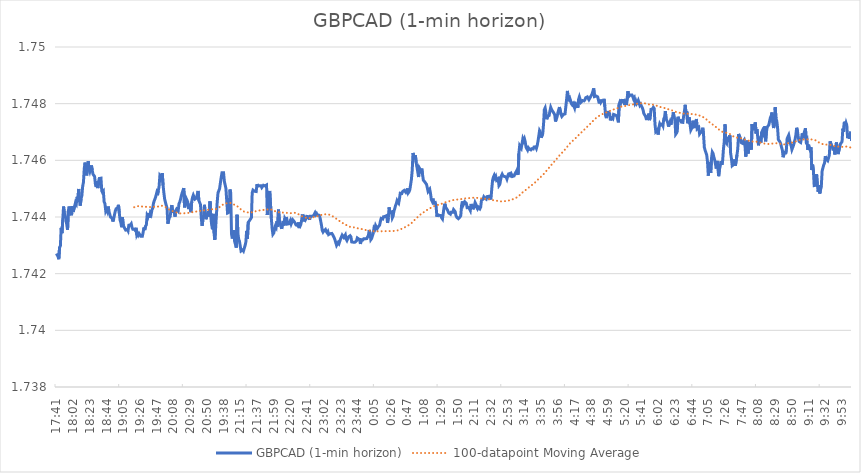
| Category | GBPCAD (1-min horizon) |
|---|---|
| 2019-04-05 17:41:00 | 1.743 |
| 2019-04-05 17:42:00 | 1.743 |
| 2019-04-05 17:43:00 | 1.743 |
| 2019-04-05 17:44:00 | 1.743 |
| 2019-04-05 17:45:00 | 1.743 |
| 2019-04-05 17:46:00 | 1.743 |
| 2019-04-05 17:47:00 | 1.744 |
| 2019-04-05 17:48:00 | 1.743 |
| 2019-04-05 17:49:00 | 1.744 |
| 2019-04-05 17:50:00 | 1.744 |
| 2019-04-05 17:51:00 | 1.744 |
| 2019-04-05 17:52:00 | 1.744 |
| 2019-04-05 17:53:00 | 1.744 |
| 2019-04-05 17:54:00 | 1.744 |
| 2019-04-05 17:55:00 | 1.744 |
| 2019-04-05 17:56:00 | 1.744 |
| 2019-04-05 17:57:00 | 1.744 |
| 2019-04-05 17:58:00 | 1.744 |
| 2019-04-05 17:59:00 | 1.744 |
| 2019-04-05 18:00:00 | 1.744 |
| 2019-04-05 18:01:00 | 1.744 |
| 2019-04-05 18:02:00 | 1.744 |
| 2019-04-05 18:03:00 | 1.744 |
| 2019-04-05 18:04:00 | 1.744 |
| 2019-04-05 18:05:00 | 1.745 |
| 2019-04-05 18:06:00 | 1.744 |
| 2019-04-05 18:07:00 | 1.745 |
| 2019-04-05 18:08:00 | 1.745 |
| 2019-04-05 18:09:00 | 1.745 |
| 2019-04-05 18:10:00 | 1.745 |
| 2019-04-05 18:11:00 | 1.744 |
| 2019-04-05 18:12:00 | 1.745 |
| 2019-04-05 18:13:00 | 1.745 |
| 2019-04-05 18:14:00 | 1.745 |
| 2019-04-05 18:15:00 | 1.745 |
| 2019-04-05 18:16:00 | 1.746 |
| 2019-04-05 18:17:00 | 1.746 |
| 2019-04-05 18:18:00 | 1.746 |
| 2019-04-05 18:19:00 | 1.745 |
| 2019-04-05 18:20:00 | 1.746 |
| 2019-04-05 18:21:00 | 1.746 |
| 2019-04-05 18:22:00 | 1.746 |
| 2019-04-05 18:23:00 | 1.746 |
| 2019-04-05 18:24:00 | 1.746 |
| 2019-04-05 18:25:00 | 1.746 |
| 2019-04-05 18:26:00 | 1.746 |
| 2019-04-05 18:27:00 | 1.746 |
| 2019-04-05 18:28:00 | 1.746 |
| 2019-04-05 18:29:00 | 1.745 |
| 2019-04-05 18:30:00 | 1.745 |
| 2019-04-05 18:31:00 | 1.745 |
| 2019-04-05 18:32:00 | 1.745 |
| 2019-04-05 18:33:00 | 1.745 |
| 2019-04-05 18:34:00 | 1.745 |
| 2019-04-05 18:35:00 | 1.745 |
| 2019-04-05 18:36:00 | 1.745 |
| 2019-04-05 18:37:00 | 1.745 |
| 2019-04-05 18:38:00 | 1.745 |
| 2019-04-05 18:39:00 | 1.745 |
| 2019-04-05 18:40:00 | 1.745 |
| 2019-04-05 18:41:00 | 1.745 |
| 2019-04-05 18:42:00 | 1.744 |
| 2019-04-05 18:43:00 | 1.744 |
| 2019-04-05 18:44:00 | 1.744 |
| 2019-04-05 18:45:00 | 1.744 |
| 2019-04-05 18:46:00 | 1.744 |
| 2019-04-05 18:47:00 | 1.744 |
| 2019-04-05 18:48:00 | 1.744 |
| 2019-04-05 18:49:00 | 1.744 |
| 2019-04-05 18:50:00 | 1.744 |
| 2019-04-05 18:51:00 | 1.744 |
| 2019-04-05 18:52:00 | 1.744 |
| 2019-04-05 18:53:00 | 1.744 |
| 2019-04-05 18:54:00 | 1.744 |
| 2019-04-05 18:55:00 | 1.744 |
| 2019-04-05 18:56:00 | 1.744 |
| 2019-04-05 18:57:00 | 1.744 |
| 2019-04-05 18:58:00 | 1.744 |
| 2019-04-05 18:59:00 | 1.744 |
| 2019-04-05 19:00:00 | 1.744 |
| 2019-04-05 19:01:00 | 1.744 |
| 2019-04-05 19:02:00 | 1.744 |
| 2019-04-05 19:03:00 | 1.744 |
| 2019-04-05 19:04:00 | 1.744 |
| 2019-04-05 19:05:00 | 1.744 |
| 2019-04-05 19:06:00 | 1.744 |
| 2019-04-05 19:07:00 | 1.744 |
| 2019-04-05 19:08:00 | 1.744 |
| 2019-04-05 19:09:00 | 1.744 |
| 2019-04-05 19:10:00 | 1.744 |
| 2019-04-05 19:11:00 | 1.744 |
| 2019-04-05 19:12:00 | 1.744 |
| 2019-04-05 19:13:00 | 1.744 |
| 2019-04-05 19:14:00 | 1.744 |
| 2019-04-05 19:15:00 | 1.744 |
| 2019-04-05 19:16:00 | 1.744 |
| 2019-04-05 19:17:00 | 1.744 |
| 2019-04-05 19:18:00 | 1.744 |
| 2019-04-05 19:19:00 | 1.744 |
| 2019-04-05 19:20:00 | 1.744 |
| 2019-04-05 19:21:00 | 1.744 |
| 2019-04-05 19:22:00 | 1.743 |
| 2019-04-05 19:23:00 | 1.743 |
| 2019-04-05 19:24:00 | 1.743 |
| 2019-04-05 19:25:00 | 1.743 |
| 2019-04-05 19:26:00 | 1.743 |
| 2019-04-05 19:27:00 | 1.743 |
| 2019-04-05 19:28:00 | 1.743 |
| 2019-04-05 19:29:00 | 1.743 |
| 2019-04-05 19:30:00 | 1.743 |
| 2019-04-05 19:31:00 | 1.744 |
| 2019-04-05 19:32:00 | 1.744 |
| 2019-04-05 19:33:00 | 1.744 |
| 2019-04-05 19:34:00 | 1.744 |
| 2019-04-05 19:35:00 | 1.744 |
| 2019-04-05 19:36:00 | 1.744 |
| 2019-04-05 19:37:00 | 1.744 |
| 2019-04-05 19:38:00 | 1.744 |
| 2019-04-05 19:39:00 | 1.744 |
| 2019-04-05 19:40:00 | 1.744 |
| 2019-04-05 19:41:00 | 1.744 |
| 2019-04-05 19:42:00 | 1.744 |
| 2019-04-05 19:43:00 | 1.744 |
| 2019-04-05 19:44:00 | 1.745 |
| 2019-04-05 19:45:00 | 1.745 |
| 2019-04-05 19:46:00 | 1.745 |
| 2019-04-05 19:47:00 | 1.745 |
| 2019-04-05 19:48:00 | 1.745 |
| 2019-04-05 19:49:00 | 1.745 |
| 2019-04-05 19:50:00 | 1.745 |
| 2019-04-05 19:51:00 | 1.745 |
| 2019-04-05 19:52:00 | 1.745 |
| 2019-04-05 19:53:00 | 1.745 |
| 2019-04-05 19:54:00 | 1.746 |
| 2019-04-05 19:55:00 | 1.745 |
| 2019-04-05 19:56:00 | 1.745 |
| 2019-04-05 19:57:00 | 1.745 |
| 2019-04-05 19:58:00 | 1.745 |
| 2019-04-05 19:59:00 | 1.744 |
| 2019-04-05 20:00:00 | 1.744 |
| 2019-04-05 20:01:00 | 1.744 |
| 2019-04-05 20:02:00 | 1.744 |
| 2019-04-05 20:03:00 | 1.744 |
| 2019-04-05 20:04:00 | 1.744 |
| 2019-04-05 20:05:00 | 1.744 |
| 2019-04-05 20:06:00 | 1.744 |
| 2019-04-05 20:07:00 | 1.744 |
| 2019-04-05 20:08:00 | 1.744 |
| 2019-04-05 20:09:00 | 1.744 |
| 2019-04-05 20:10:00 | 1.744 |
| 2019-04-05 20:11:00 | 1.744 |
| 2019-04-05 20:12:00 | 1.744 |
| 2019-04-05 20:13:00 | 1.744 |
| 2019-04-05 20:14:00 | 1.744 |
| 2019-04-05 20:15:00 | 1.744 |
| 2019-04-05 20:16:00 | 1.745 |
| 2019-04-05 20:17:00 | 1.745 |
| 2019-04-05 20:18:00 | 1.745 |
| 2019-04-05 20:19:00 | 1.745 |
| 2019-04-05 20:20:00 | 1.745 |
| 2019-04-05 20:21:00 | 1.745 |
| 2019-04-05 20:22:00 | 1.744 |
| 2019-04-05 20:23:00 | 1.744 |
| 2019-04-05 20:24:00 | 1.745 |
| 2019-04-05 20:25:00 | 1.745 |
| 2019-04-05 20:26:00 | 1.745 |
| 2019-04-05 20:27:00 | 1.744 |
| 2019-04-05 20:28:00 | 1.744 |
| 2019-04-05 20:29:00 | 1.744 |
| 2019-04-05 20:30:00 | 1.744 |
| 2019-04-05 20:31:00 | 1.745 |
| 2019-04-05 20:32:00 | 1.745 |
| 2019-04-05 20:33:00 | 1.745 |
| 2019-04-05 20:34:00 | 1.745 |
| 2019-04-05 20:35:00 | 1.745 |
| 2019-04-05 20:36:00 | 1.745 |
| 2019-04-05 20:37:00 | 1.745 |
| 2019-04-05 20:38:00 | 1.745 |
| 2019-04-05 20:39:00 | 1.745 |
| 2019-04-05 20:40:00 | 1.745 |
| 2019-04-05 20:41:00 | 1.745 |
| 2019-04-05 20:42:00 | 1.744 |
| 2019-04-05 20:43:00 | 1.744 |
| 2019-04-05 20:44:00 | 1.744 |
| 2019-04-05 20:45:00 | 1.744 |
| 2019-04-05 20:46:00 | 1.744 |
| 2019-04-05 20:47:00 | 1.744 |
| 2019-04-05 20:48:00 | 1.744 |
| 2019-04-05 20:49:00 | 1.744 |
| 2019-04-05 20:50:00 | 1.744 |
| 2019-04-05 20:51:00 | 1.744 |
| 2019-04-05 20:52:00 | 1.744 |
| 2019-04-05 20:53:00 | 1.744 |
| 2019-04-05 20:54:00 | 1.745 |
| 2019-04-05 20:55:00 | 1.744 |
| 2019-04-05 20:56:00 | 1.744 |
| 2019-04-05 20:57:00 | 1.744 |
| 2019-04-05 20:58:00 | 1.744 |
| 2019-04-07 19:00:00 | 1.743 |
| 2019-04-07 19:01:00 | 1.743 |
| 2019-04-07 19:02:00 | 1.744 |
| 2019-04-07 19:05:00 | 1.744 |
| 2019-04-07 19:08:00 | 1.745 |
| 2019-04-07 19:09:00 | 1.745 |
| 2019-04-07 19:10:00 | 1.745 |
| 2019-04-07 19:12:00 | 1.745 |
| 2019-04-07 19:13:00 | 1.745 |
| 2019-04-07 19:16:00 | 1.745 |
| 2019-04-07 19:17:00 | 1.746 |
| 2019-04-07 19:25:00 | 1.746 |
| 2019-04-07 19:38:00 | 1.746 |
| 2019-04-07 19:41:00 | 1.745 |
| 2019-04-07 19:42:00 | 1.745 |
| 2019-04-07 19:45:00 | 1.745 |
| 2019-04-07 19:58:00 | 1.745 |
| 2019-04-07 20:59:00 | 1.744 |
| 2019-04-07 21:00:00 | 1.744 |
| 2019-04-07 21:01:00 | 1.744 |
| 2019-04-07 21:02:00 | 1.745 |
| 2019-04-07 21:03:00 | 1.745 |
| 2019-04-07 21:04:00 | 1.743 |
| 2019-04-07 21:05:00 | 1.743 |
| 2019-04-07 21:06:00 | 1.743 |
| 2019-04-07 21:07:00 | 1.744 |
| 2019-04-07 21:08:00 | 1.743 |
| 2019-04-07 21:09:00 | 1.743 |
| 2019-04-07 21:10:00 | 1.743 |
| 2019-04-07 21:11:00 | 1.744 |
| 2019-04-07 21:12:00 | 1.743 |
| 2019-04-07 21:13:00 | 1.743 |
| 2019-04-07 21:14:00 | 1.743 |
| 2019-04-07 21:15:00 | 1.743 |
| 2019-04-07 21:16:00 | 1.743 |
| 2019-04-07 21:17:00 | 1.743 |
| 2019-04-07 21:18:00 | 1.743 |
| 2019-04-07 21:19:00 | 1.743 |
| 2019-04-07 21:20:00 | 1.743 |
| 2019-04-07 21:21:00 | 1.743 |
| 2019-04-07 21:22:00 | 1.743 |
| 2019-04-07 21:23:00 | 1.744 |
| 2019-04-07 21:24:00 | 1.743 |
| 2019-04-07 21:25:00 | 1.744 |
| 2019-04-07 21:26:00 | 1.744 |
| 2019-04-07 21:27:00 | 1.744 |
| 2019-04-07 21:28:00 | 1.744 |
| 2019-04-07 21:29:00 | 1.744 |
| 2019-04-07 21:30:00 | 1.745 |
| 2019-04-07 21:31:00 | 1.745 |
| 2019-04-07 21:32:00 | 1.745 |
| 2019-04-07 21:33:00 | 1.745 |
| 2019-04-07 21:35:00 | 1.745 |
| 2019-04-07 21:36:00 | 1.745 |
| 2019-04-07 21:37:00 | 1.745 |
| 2019-04-07 21:38:00 | 1.745 |
| 2019-04-07 21:39:00 | 1.745 |
| 2019-04-07 21:40:00 | 1.745 |
| 2019-04-07 21:41:00 | 1.745 |
| 2019-04-07 21:43:00 | 1.745 |
| 2019-04-07 21:44:00 | 1.745 |
| 2019-04-07 21:45:00 | 1.745 |
| 2019-04-07 21:46:00 | 1.745 |
| 2019-04-07 21:47:00 | 1.745 |
| 2019-04-07 21:48:00 | 1.745 |
| 2019-04-07 21:49:00 | 1.745 |
| 2019-04-07 21:50:00 | 1.745 |
| 2019-04-07 21:51:00 | 1.744 |
| 2019-04-07 21:52:00 | 1.745 |
| 2019-04-07 21:53:00 | 1.745 |
| 2019-04-07 21:54:00 | 1.745 |
| 2019-04-07 21:55:00 | 1.745 |
| 2019-04-07 21:56:00 | 1.744 |
| 2019-04-07 21:57:00 | 1.744 |
| 2019-04-07 21:58:00 | 1.743 |
| 2019-04-07 21:59:00 | 1.743 |
| 2019-04-07 22:00:00 | 1.743 |
| 2019-04-07 22:01:00 | 1.744 |
| 2019-04-07 22:02:00 | 1.744 |
| 2019-04-07 22:03:00 | 1.744 |
| 2019-04-07 22:04:00 | 1.744 |
| 2019-04-07 22:05:00 | 1.744 |
| 2019-04-07 22:06:00 | 1.744 |
| 2019-04-07 22:07:00 | 1.744 |
| 2019-04-07 22:08:00 | 1.744 |
| 2019-04-07 22:09:00 | 1.744 |
| 2019-04-07 22:10:00 | 1.744 |
| 2019-04-07 22:11:00 | 1.744 |
| 2019-04-07 22:12:00 | 1.744 |
| 2019-04-07 22:13:00 | 1.744 |
| 2019-04-07 22:14:00 | 1.744 |
| 2019-04-07 22:15:00 | 1.744 |
| 2019-04-07 22:16:00 | 1.744 |
| 2019-04-07 22:17:00 | 1.744 |
| 2019-04-07 22:18:00 | 1.744 |
| 2019-04-07 22:19:00 | 1.744 |
| 2019-04-07 22:20:00 | 1.744 |
| 2019-04-07 22:21:00 | 1.744 |
| 2019-04-07 22:22:00 | 1.744 |
| 2019-04-07 22:23:00 | 1.744 |
| 2019-04-07 22:24:00 | 1.744 |
| 2019-04-07 22:25:00 | 1.744 |
| 2019-04-07 22:26:00 | 1.744 |
| 2019-04-07 22:27:00 | 1.744 |
| 2019-04-07 22:28:00 | 1.744 |
| 2019-04-07 22:29:00 | 1.744 |
| 2019-04-07 22:30:00 | 1.744 |
| 2019-04-07 22:31:00 | 1.744 |
| 2019-04-07 22:32:00 | 1.744 |
| 2019-04-07 22:33:00 | 1.744 |
| 2019-04-07 22:34:00 | 1.744 |
| 2019-04-07 22:35:00 | 1.744 |
| 2019-04-07 22:36:00 | 1.744 |
| 2019-04-07 22:37:00 | 1.744 |
| 2019-04-07 22:38:00 | 1.744 |
| 2019-04-07 22:39:00 | 1.744 |
| 2019-04-07 22:40:00 | 1.744 |
| 2019-04-07 22:41:00 | 1.744 |
| 2019-04-07 22:42:00 | 1.744 |
| 2019-04-07 22:43:00 | 1.744 |
| 2019-04-07 22:44:00 | 1.744 |
| 2019-04-07 22:45:00 | 1.744 |
| 2019-04-07 22:46:00 | 1.744 |
| 2019-04-07 22:47:00 | 1.744 |
| 2019-04-07 22:48:00 | 1.744 |
| 2019-04-07 22:49:00 | 1.744 |
| 2019-04-07 22:50:00 | 1.744 |
| 2019-04-07 22:51:00 | 1.744 |
| 2019-04-07 22:52:00 | 1.744 |
| 2019-04-07 22:53:00 | 1.744 |
| 2019-04-07 22:54:00 | 1.744 |
| 2019-04-07 22:55:00 | 1.744 |
| 2019-04-07 22:56:00 | 1.744 |
| 2019-04-07 22:57:00 | 1.744 |
| 2019-04-07 22:58:00 | 1.744 |
| 2019-04-07 22:59:00 | 1.744 |
| 2019-04-07 23:00:00 | 1.744 |
| 2019-04-07 23:01:00 | 1.743 |
| 2019-04-07 23:02:00 | 1.744 |
| 2019-04-07 23:03:00 | 1.744 |
| 2019-04-07 23:04:00 | 1.744 |
| 2019-04-07 23:05:00 | 1.743 |
| 2019-04-07 23:06:00 | 1.743 |
| 2019-04-07 23:07:00 | 1.743 |
| 2019-04-07 23:08:00 | 1.743 |
| 2019-04-07 23:09:00 | 1.743 |
| 2019-04-07 23:10:00 | 1.743 |
| 2019-04-07 23:11:00 | 1.743 |
| 2019-04-07 23:12:00 | 1.743 |
| 2019-04-07 23:13:00 | 1.743 |
| 2019-04-07 23:14:00 | 1.743 |
| 2019-04-07 23:15:00 | 1.743 |
| 2019-04-07 23:16:00 | 1.743 |
| 2019-04-07 23:17:00 | 1.743 |
| 2019-04-07 23:18:00 | 1.743 |
| 2019-04-07 23:19:00 | 1.743 |
| 2019-04-07 23:20:00 | 1.743 |
| 2019-04-07 23:21:00 | 1.743 |
| 2019-04-07 23:22:00 | 1.743 |
| 2019-04-07 23:23:00 | 1.743 |
| 2019-04-07 23:24:00 | 1.743 |
| 2019-04-07 23:25:00 | 1.743 |
| 2019-04-07 23:26:00 | 1.743 |
| 2019-04-07 23:27:00 | 1.743 |
| 2019-04-07 23:28:00 | 1.743 |
| 2019-04-07 23:29:00 | 1.743 |
| 2019-04-07 23:30:00 | 1.743 |
| 2019-04-07 23:31:00 | 1.743 |
| 2019-04-07 23:32:00 | 1.743 |
| 2019-04-07 23:33:00 | 1.743 |
| 2019-04-07 23:34:00 | 1.743 |
| 2019-04-07 23:35:00 | 1.743 |
| 2019-04-07 23:36:00 | 1.743 |
| 2019-04-07 23:37:00 | 1.743 |
| 2019-04-07 23:38:00 | 1.743 |
| 2019-04-07 23:39:00 | 1.743 |
| 2019-04-07 23:40:00 | 1.743 |
| 2019-04-07 23:41:00 | 1.743 |
| 2019-04-07 23:42:00 | 1.743 |
| 2019-04-07 23:43:00 | 1.743 |
| 2019-04-07 23:44:00 | 1.743 |
| 2019-04-07 23:45:00 | 1.743 |
| 2019-04-07 23:46:00 | 1.743 |
| 2019-04-07 23:47:00 | 1.743 |
| 2019-04-07 23:48:00 | 1.743 |
| 2019-04-07 23:49:00 | 1.743 |
| 2019-04-07 23:50:00 | 1.743 |
| 2019-04-07 23:51:00 | 1.743 |
| 2019-04-07 23:52:00 | 1.743 |
| 2019-04-07 23:53:00 | 1.743 |
| 2019-04-07 23:54:00 | 1.743 |
| 2019-04-07 23:55:00 | 1.743 |
| 2019-04-07 23:56:00 | 1.743 |
| 2019-04-07 23:57:00 | 1.743 |
| 2019-04-07 23:58:00 | 1.743 |
| 2019-04-07 23:59:00 | 1.744 |
| 2019-04-08 | 1.743 |
| 2019-04-08 00:01:00 | 1.743 |
| 2019-04-08 00:02:00 | 1.743 |
| 2019-04-08 00:03:00 | 1.743 |
| 2019-04-08 00:04:00 | 1.743 |
| 2019-04-08 00:05:00 | 1.744 |
| 2019-04-08 00:06:00 | 1.744 |
| 2019-04-08 00:07:00 | 1.744 |
| 2019-04-08 00:08:00 | 1.744 |
| 2019-04-08 00:09:00 | 1.744 |
| 2019-04-08 00:10:00 | 1.744 |
| 2019-04-08 00:11:00 | 1.744 |
| 2019-04-08 00:12:00 | 1.744 |
| 2019-04-08 00:13:00 | 1.744 |
| 2019-04-08 00:14:00 | 1.744 |
| 2019-04-08 00:15:00 | 1.744 |
| 2019-04-08 00:16:00 | 1.744 |
| 2019-04-08 00:17:00 | 1.744 |
| 2019-04-08 00:18:00 | 1.744 |
| 2019-04-08 00:19:00 | 1.744 |
| 2019-04-08 00:20:00 | 1.744 |
| 2019-04-08 00:21:00 | 1.744 |
| 2019-04-08 00:22:00 | 1.744 |
| 2019-04-08 00:23:00 | 1.744 |
| 2019-04-08 00:24:00 | 1.744 |
| 2019-04-08 00:25:00 | 1.744 |
| 2019-04-08 00:26:00 | 1.744 |
| 2019-04-08 00:27:00 | 1.744 |
| 2019-04-08 00:28:00 | 1.744 |
| 2019-04-08 00:29:00 | 1.744 |
| 2019-04-08 00:30:00 | 1.744 |
| 2019-04-08 00:31:00 | 1.744 |
| 2019-04-08 00:32:00 | 1.744 |
| 2019-04-08 00:33:00 | 1.744 |
| 2019-04-08 00:34:00 | 1.745 |
| 2019-04-08 00:35:00 | 1.745 |
| 2019-04-08 00:36:00 | 1.744 |
| 2019-04-08 00:37:00 | 1.745 |
| 2019-04-08 00:38:00 | 1.745 |
| 2019-04-08 00:39:00 | 1.745 |
| 2019-04-08 00:40:00 | 1.745 |
| 2019-04-08 00:41:00 | 1.745 |
| 2019-04-08 00:42:00 | 1.745 |
| 2019-04-08 00:43:00 | 1.745 |
| 2019-04-08 00:44:00 | 1.745 |
| 2019-04-08 00:45:00 | 1.745 |
| 2019-04-08 00:46:00 | 1.745 |
| 2019-04-08 00:47:00 | 1.745 |
| 2019-04-08 00:48:00 | 1.745 |
| 2019-04-08 00:49:00 | 1.745 |
| 2019-04-08 00:50:00 | 1.745 |
| 2019-04-08 00:51:00 | 1.745 |
| 2019-04-08 00:52:00 | 1.745 |
| 2019-04-08 00:53:00 | 1.746 |
| 2019-04-08 00:54:00 | 1.746 |
| 2019-04-08 00:55:00 | 1.746 |
| 2019-04-08 00:56:00 | 1.746 |
| 2019-04-08 00:57:00 | 1.746 |
| 2019-04-08 00:58:00 | 1.746 |
| 2019-04-08 00:59:00 | 1.746 |
| 2019-04-08 01:00:00 | 1.746 |
| 2019-04-08 01:01:00 | 1.745 |
| 2019-04-08 01:02:00 | 1.746 |
| 2019-04-08 01:03:00 | 1.746 |
| 2019-04-08 01:04:00 | 1.746 |
| 2019-04-08 01:05:00 | 1.746 |
| 2019-04-08 01:06:00 | 1.745 |
| 2019-04-08 01:07:00 | 1.745 |
| 2019-04-08 01:08:00 | 1.745 |
| 2019-04-08 01:09:00 | 1.745 |
| 2019-04-08 01:10:00 | 1.745 |
| 2019-04-08 01:11:00 | 1.745 |
| 2019-04-08 01:12:00 | 1.745 |
| 2019-04-08 01:13:00 | 1.745 |
| 2019-04-08 01:14:00 | 1.745 |
| 2019-04-08 01:15:00 | 1.745 |
| 2019-04-08 01:16:00 | 1.745 |
| 2019-04-08 01:17:00 | 1.745 |
| 2019-04-08 01:18:00 | 1.745 |
| 2019-04-08 01:19:00 | 1.745 |
| 2019-04-08 01:20:00 | 1.744 |
| 2019-04-08 01:21:00 | 1.744 |
| 2019-04-08 01:22:00 | 1.745 |
| 2019-04-08 01:23:00 | 1.744 |
| 2019-04-08 01:24:00 | 1.744 |
| 2019-04-08 01:25:00 | 1.744 |
| 2019-04-08 01:26:00 | 1.744 |
| 2019-04-08 01:27:00 | 1.744 |
| 2019-04-08 01:28:00 | 1.744 |
| 2019-04-08 01:29:00 | 1.744 |
| 2019-04-08 01:30:00 | 1.744 |
| 2019-04-08 01:31:00 | 1.744 |
| 2019-04-08 01:32:00 | 1.744 |
| 2019-04-08 01:33:00 | 1.744 |
| 2019-04-08 01:34:00 | 1.744 |
| 2019-04-08 01:35:00 | 1.744 |
| 2019-04-08 01:36:00 | 1.744 |
| 2019-04-08 01:37:00 | 1.744 |
| 2019-04-08 01:38:00 | 1.744 |
| 2019-04-08 01:39:00 | 1.744 |
| 2019-04-08 01:40:00 | 1.744 |
| 2019-04-08 01:41:00 | 1.744 |
| 2019-04-08 01:42:00 | 1.744 |
| 2019-04-08 01:43:00 | 1.744 |
| 2019-04-08 01:44:00 | 1.744 |
| 2019-04-08 01:45:00 | 1.744 |
| 2019-04-08 01:46:00 | 1.744 |
| 2019-04-08 01:47:00 | 1.744 |
| 2019-04-08 01:48:00 | 1.744 |
| 2019-04-08 01:49:00 | 1.744 |
| 2019-04-08 01:50:00 | 1.744 |
| 2019-04-08 01:51:00 | 1.744 |
| 2019-04-08 01:52:00 | 1.744 |
| 2019-04-08 01:53:00 | 1.744 |
| 2019-04-08 01:54:00 | 1.744 |
| 2019-04-08 01:55:00 | 1.744 |
| 2019-04-08 01:56:00 | 1.745 |
| 2019-04-08 01:57:00 | 1.744 |
| 2019-04-08 01:58:00 | 1.744 |
| 2019-04-08 01:59:00 | 1.745 |
| 2019-04-08 02:00:00 | 1.745 |
| 2019-04-08 02:01:00 | 1.744 |
| 2019-04-08 02:02:00 | 1.744 |
| 2019-04-08 02:03:00 | 1.744 |
| 2019-04-08 02:04:00 | 1.744 |
| 2019-04-08 02:05:00 | 1.744 |
| 2019-04-08 02:06:00 | 1.744 |
| 2019-04-08 02:07:00 | 1.744 |
| 2019-04-08 02:08:00 | 1.744 |
| 2019-04-08 02:09:00 | 1.744 |
| 2019-04-08 02:10:00 | 1.744 |
| 2019-04-08 02:11:00 | 1.744 |
| 2019-04-08 02:12:00 | 1.745 |
| 2019-04-08 02:13:00 | 1.744 |
| 2019-04-08 02:14:00 | 1.744 |
| 2019-04-08 02:15:00 | 1.744 |
| 2019-04-08 02:16:00 | 1.744 |
| 2019-04-08 02:17:00 | 1.744 |
| 2019-04-08 02:18:00 | 1.744 |
| 2019-04-08 02:19:00 | 1.744 |
| 2019-04-08 02:20:00 | 1.745 |
| 2019-04-08 02:21:00 | 1.745 |
| 2019-04-08 02:22:00 | 1.745 |
| 2019-04-08 02:23:00 | 1.745 |
| 2019-04-08 02:24:00 | 1.745 |
| 2019-04-08 02:25:00 | 1.745 |
| 2019-04-08 02:26:00 | 1.745 |
| 2019-04-08 02:27:00 | 1.745 |
| 2019-04-08 02:28:00 | 1.745 |
| 2019-04-08 02:29:00 | 1.745 |
| 2019-04-08 02:30:00 | 1.745 |
| 2019-04-08 02:31:00 | 1.745 |
| 2019-04-08 02:32:00 | 1.745 |
| 2019-04-08 02:33:00 | 1.745 |
| 2019-04-08 02:34:00 | 1.745 |
| 2019-04-08 02:35:00 | 1.745 |
| 2019-04-08 02:36:00 | 1.745 |
| 2019-04-08 02:37:00 | 1.745 |
| 2019-04-08 02:38:00 | 1.745 |
| 2019-04-08 02:39:00 | 1.745 |
| 2019-04-08 02:40:00 | 1.745 |
| 2019-04-08 02:41:00 | 1.745 |
| 2019-04-08 02:42:00 | 1.745 |
| 2019-04-08 02:43:00 | 1.745 |
| 2019-04-08 02:44:00 | 1.745 |
| 2019-04-08 02:45:00 | 1.745 |
| 2019-04-08 02:46:00 | 1.746 |
| 2019-04-08 02:47:00 | 1.745 |
| 2019-04-08 02:48:00 | 1.745 |
| 2019-04-08 02:49:00 | 1.745 |
| 2019-04-08 02:50:00 | 1.745 |
| 2019-04-08 02:51:00 | 1.745 |
| 2019-04-08 02:52:00 | 1.745 |
| 2019-04-08 02:53:00 | 1.745 |
| 2019-04-08 02:54:00 | 1.746 |
| 2019-04-08 02:55:00 | 1.746 |
| 2019-04-08 02:56:00 | 1.746 |
| 2019-04-08 02:57:00 | 1.745 |
| 2019-04-08 02:58:00 | 1.745 |
| 2019-04-08 02:59:00 | 1.745 |
| 2019-04-08 03:00:00 | 1.745 |
| 2019-04-08 03:01:00 | 1.745 |
| 2019-04-08 03:02:00 | 1.746 |
| 2019-04-08 03:03:00 | 1.746 |
| 2019-04-08 03:04:00 | 1.746 |
| 2019-04-08 03:05:00 | 1.746 |
| 2019-04-08 03:06:00 | 1.745 |
| 2019-04-08 03:07:00 | 1.746 |
| 2019-04-08 03:08:00 | 1.747 |
| 2019-04-08 03:09:00 | 1.747 |
| 2019-04-08 03:10:00 | 1.746 |
| 2019-04-08 03:11:00 | 1.747 |
| 2019-04-08 03:12:00 | 1.747 |
| 2019-04-08 03:13:00 | 1.747 |
| 2019-04-08 03:14:00 | 1.747 |
| 2019-04-08 03:15:00 | 1.747 |
| 2019-04-08 03:16:00 | 1.746 |
| 2019-04-08 03:17:00 | 1.746 |
| 2019-04-08 03:18:00 | 1.746 |
| 2019-04-08 03:19:00 | 1.746 |
| 2019-04-08 03:20:00 | 1.746 |
| 2019-04-08 03:21:00 | 1.746 |
| 2019-04-08 03:22:00 | 1.746 |
| 2019-04-08 03:23:00 | 1.746 |
| 2019-04-08 03:24:00 | 1.746 |
| 2019-04-08 03:25:00 | 1.746 |
| 2019-04-08 03:26:00 | 1.746 |
| 2019-04-08 03:27:00 | 1.746 |
| 2019-04-08 03:28:00 | 1.746 |
| 2019-04-08 03:29:00 | 1.746 |
| 2019-04-08 03:30:00 | 1.747 |
| 2019-04-08 03:31:00 | 1.747 |
| 2019-04-08 03:32:00 | 1.747 |
| 2019-04-08 03:33:00 | 1.747 |
| 2019-04-08 03:34:00 | 1.747 |
| 2019-04-08 03:35:00 | 1.747 |
| 2019-04-08 03:36:00 | 1.747 |
| 2019-04-08 03:37:00 | 1.747 |
| 2019-04-08 03:38:00 | 1.747 |
| 2019-04-08 03:39:00 | 1.748 |
| 2019-04-08 03:40:00 | 1.748 |
| 2019-04-08 03:41:00 | 1.748 |
| 2019-04-08 03:42:00 | 1.747 |
| 2019-04-08 03:43:00 | 1.748 |
| 2019-04-08 03:44:00 | 1.748 |
| 2019-04-08 03:45:00 | 1.748 |
| 2019-04-08 03:46:00 | 1.748 |
| 2019-04-08 03:47:00 | 1.748 |
| 2019-04-08 03:48:00 | 1.748 |
| 2019-04-08 03:49:00 | 1.748 |
| 2019-04-08 03:50:00 | 1.748 |
| 2019-04-08 03:51:00 | 1.748 |
| 2019-04-08 03:52:00 | 1.748 |
| 2019-04-08 03:53:00 | 1.747 |
| 2019-04-08 03:54:00 | 1.747 |
| 2019-04-08 03:55:00 | 1.748 |
| 2019-04-08 03:56:00 | 1.748 |
| 2019-04-08 03:57:00 | 1.748 |
| 2019-04-08 03:58:00 | 1.748 |
| 2019-04-08 03:59:00 | 1.748 |
| 2019-04-08 04:00:00 | 1.748 |
| 2019-04-08 04:01:00 | 1.748 |
| 2019-04-08 04:02:00 | 1.748 |
| 2019-04-08 04:03:00 | 1.748 |
| 2019-04-08 04:04:00 | 1.748 |
| 2019-04-08 04:05:00 | 1.748 |
| 2019-04-08 04:06:00 | 1.748 |
| 2019-04-08 04:07:00 | 1.748 |
| 2019-04-08 04:08:00 | 1.748 |
| 2019-04-08 04:09:00 | 1.748 |
| 2019-04-08 04:10:00 | 1.748 |
| 2019-04-08 04:11:00 | 1.748 |
| 2019-04-08 04:12:00 | 1.748 |
| 2019-04-08 04:13:00 | 1.748 |
| 2019-04-08 04:14:00 | 1.748 |
| 2019-04-08 04:15:00 | 1.748 |
| 2019-04-08 04:16:00 | 1.748 |
| 2019-04-08 04:17:00 | 1.748 |
| 2019-04-08 04:18:00 | 1.748 |
| 2019-04-08 04:19:00 | 1.748 |
| 2019-04-08 04:20:00 | 1.748 |
| 2019-04-08 04:21:00 | 1.748 |
| 2019-04-08 04:22:00 | 1.748 |
| 2019-04-08 04:23:00 | 1.748 |
| 2019-04-08 04:24:00 | 1.748 |
| 2019-04-08 04:25:00 | 1.748 |
| 2019-04-08 04:26:00 | 1.748 |
| 2019-04-08 04:27:00 | 1.748 |
| 2019-04-08 04:28:00 | 1.748 |
| 2019-04-08 04:29:00 | 1.748 |
| 2019-04-08 04:30:00 | 1.748 |
| 2019-04-08 04:31:00 | 1.748 |
| 2019-04-08 04:32:00 | 1.748 |
| 2019-04-08 04:33:00 | 1.748 |
| 2019-04-08 04:34:00 | 1.748 |
| 2019-04-08 04:35:00 | 1.748 |
| 2019-04-08 04:36:00 | 1.748 |
| 2019-04-08 04:37:00 | 1.748 |
| 2019-04-08 04:38:00 | 1.748 |
| 2019-04-08 04:39:00 | 1.748 |
| 2019-04-08 04:40:00 | 1.748 |
| 2019-04-08 04:41:00 | 1.749 |
| 2019-04-08 04:42:00 | 1.748 |
| 2019-04-08 04:43:00 | 1.748 |
| 2019-04-08 04:44:00 | 1.748 |
| 2019-04-08 04:45:00 | 1.748 |
| 2019-04-08 04:46:00 | 1.748 |
| 2019-04-08 04:47:00 | 1.748 |
| 2019-04-08 04:48:00 | 1.748 |
| 2019-04-08 04:49:00 | 1.748 |
| 2019-04-08 04:50:00 | 1.748 |
| 2019-04-08 04:51:00 | 1.748 |
| 2019-04-08 04:52:00 | 1.748 |
| 2019-04-08 04:53:00 | 1.748 |
| 2019-04-08 04:54:00 | 1.748 |
| 2019-04-08 04:55:00 | 1.748 |
| 2019-04-08 04:56:00 | 1.748 |
| 2019-04-08 04:57:00 | 1.747 |
| 2019-04-08 04:58:00 | 1.748 |
| 2019-04-08 04:59:00 | 1.748 |
| 2019-04-08 05:00:00 | 1.748 |
| 2019-04-08 05:01:00 | 1.748 |
| 2019-04-08 05:02:00 | 1.747 |
| 2019-04-08 05:03:00 | 1.748 |
| 2019-04-08 05:04:00 | 1.748 |
| 2019-04-08 05:05:00 | 1.747 |
| 2019-04-08 05:06:00 | 1.748 |
| 2019-04-08 05:07:00 | 1.748 |
| 2019-04-08 05:08:00 | 1.748 |
| 2019-04-08 05:09:00 | 1.748 |
| 2019-04-08 05:10:00 | 1.748 |
| 2019-04-08 05:11:00 | 1.748 |
| 2019-04-08 05:12:00 | 1.747 |
| 2019-04-08 05:13:00 | 1.748 |
| 2019-04-08 05:14:00 | 1.748 |
| 2019-04-08 05:15:00 | 1.748 |
| 2019-04-08 05:16:00 | 1.748 |
| 2019-04-08 05:17:00 | 1.748 |
| 2019-04-08 05:18:00 | 1.748 |
| 2019-04-08 05:19:00 | 1.748 |
| 2019-04-08 05:20:00 | 1.748 |
| 2019-04-08 05:21:00 | 1.748 |
| 2019-04-08 05:22:00 | 1.748 |
| 2019-04-08 05:23:00 | 1.748 |
| 2019-04-08 05:24:00 | 1.748 |
| 2019-04-08 05:25:00 | 1.748 |
| 2019-04-08 05:26:00 | 1.748 |
| 2019-04-08 05:27:00 | 1.748 |
| 2019-04-08 05:28:00 | 1.748 |
| 2019-04-08 05:29:00 | 1.748 |
| 2019-04-08 05:30:00 | 1.748 |
| 2019-04-08 05:31:00 | 1.748 |
| 2019-04-08 05:32:00 | 1.748 |
| 2019-04-08 05:33:00 | 1.748 |
| 2019-04-08 05:34:00 | 1.748 |
| 2019-04-08 05:35:00 | 1.748 |
| 2019-04-08 05:36:00 | 1.748 |
| 2019-04-08 05:37:00 | 1.748 |
| 2019-04-08 05:38:00 | 1.748 |
| 2019-04-08 05:39:00 | 1.748 |
| 2019-04-08 05:40:00 | 1.748 |
| 2019-04-08 05:41:00 | 1.748 |
| 2019-04-08 05:42:00 | 1.748 |
| 2019-04-08 05:43:00 | 1.748 |
| 2019-04-08 05:44:00 | 1.748 |
| 2019-04-08 05:45:00 | 1.748 |
| 2019-04-08 05:46:00 | 1.748 |
| 2019-04-08 05:47:00 | 1.747 |
| 2019-04-08 05:48:00 | 1.748 |
| 2019-04-08 05:49:00 | 1.747 |
| 2019-04-08 05:50:00 | 1.748 |
| 2019-04-08 05:51:00 | 1.747 |
| 2019-04-08 05:52:00 | 1.748 |
| 2019-04-08 05:53:00 | 1.748 |
| 2019-04-08 05:54:00 | 1.748 |
| 2019-04-08 05:55:00 | 1.748 |
| 2019-04-08 05:56:00 | 1.748 |
| 2019-04-08 05:57:00 | 1.748 |
| 2019-04-08 05:58:00 | 1.747 |
| 2019-04-08 05:59:00 | 1.747 |
| 2019-04-08 06:00:00 | 1.747 |
| 2019-04-08 06:01:00 | 1.747 |
| 2019-04-08 06:02:00 | 1.747 |
| 2019-04-08 06:03:00 | 1.747 |
| 2019-04-08 06:04:00 | 1.747 |
| 2019-04-08 06:05:00 | 1.747 |
| 2019-04-08 06:06:00 | 1.747 |
| 2019-04-08 06:07:00 | 1.747 |
| 2019-04-08 06:08:00 | 1.747 |
| 2019-04-08 06:09:00 | 1.747 |
| 2019-04-08 06:10:00 | 1.748 |
| 2019-04-08 06:11:00 | 1.748 |
| 2019-04-08 06:12:00 | 1.747 |
| 2019-04-08 06:13:00 | 1.747 |
| 2019-04-08 06:14:00 | 1.747 |
| 2019-04-08 06:15:00 | 1.747 |
| 2019-04-08 06:16:00 | 1.747 |
| 2019-04-08 06:17:00 | 1.747 |
| 2019-04-08 06:18:00 | 1.747 |
| 2019-04-08 06:19:00 | 1.747 |
| 2019-04-08 06:20:00 | 1.748 |
| 2019-04-08 06:21:00 | 1.748 |
| 2019-04-08 06:22:00 | 1.748 |
| 2019-04-08 06:23:00 | 1.747 |
| 2019-04-08 06:24:00 | 1.747 |
| 2019-04-08 06:25:00 | 1.747 |
| 2019-04-08 06:26:00 | 1.747 |
| 2019-04-08 06:27:00 | 1.748 |
| 2019-04-08 06:28:00 | 1.747 |
| 2019-04-08 06:29:00 | 1.747 |
| 2019-04-08 06:30:00 | 1.747 |
| 2019-04-08 06:31:00 | 1.747 |
| 2019-04-08 06:32:00 | 1.747 |
| 2019-04-08 06:33:00 | 1.747 |
| 2019-04-08 06:34:00 | 1.748 |
| 2019-04-08 06:35:00 | 1.748 |
| 2019-04-08 06:36:00 | 1.748 |
| 2019-04-08 06:37:00 | 1.748 |
| 2019-04-08 06:38:00 | 1.748 |
| 2019-04-08 06:39:00 | 1.747 |
| 2019-04-08 06:40:00 | 1.747 |
| 2019-04-08 06:41:00 | 1.748 |
| 2019-04-08 06:42:00 | 1.747 |
| 2019-04-08 06:43:00 | 1.747 |
| 2019-04-08 06:44:00 | 1.747 |
| 2019-04-08 06:45:00 | 1.747 |
| 2019-04-08 06:46:00 | 1.747 |
| 2019-04-08 06:47:00 | 1.747 |
| 2019-04-08 06:48:00 | 1.747 |
| 2019-04-08 06:49:00 | 1.747 |
| 2019-04-08 06:50:00 | 1.747 |
| 2019-04-08 06:51:00 | 1.747 |
| 2019-04-08 06:52:00 | 1.747 |
| 2019-04-08 06:53:00 | 1.747 |
| 2019-04-08 06:54:00 | 1.747 |
| 2019-04-08 06:55:00 | 1.747 |
| 2019-04-08 06:56:00 | 1.747 |
| 2019-04-08 06:57:00 | 1.747 |
| 2019-04-08 06:58:00 | 1.747 |
| 2019-04-08 06:59:00 | 1.747 |
| 2019-04-08 07:00:00 | 1.746 |
| 2019-04-08 07:01:00 | 1.746 |
| 2019-04-08 07:02:00 | 1.746 |
| 2019-04-08 07:03:00 | 1.746 |
| 2019-04-08 07:04:00 | 1.746 |
| 2019-04-08 07:05:00 | 1.745 |
| 2019-04-08 07:06:00 | 1.746 |
| 2019-04-08 07:07:00 | 1.746 |
| 2019-04-08 07:08:00 | 1.746 |
| 2019-04-08 07:09:00 | 1.746 |
| 2019-04-08 07:10:00 | 1.746 |
| 2019-04-08 07:11:00 | 1.746 |
| 2019-04-08 07:12:00 | 1.746 |
| 2019-04-08 07:13:00 | 1.746 |
| 2019-04-08 07:14:00 | 1.746 |
| 2019-04-08 07:15:00 | 1.746 |
| 2019-04-08 07:16:00 | 1.746 |
| 2019-04-08 07:17:00 | 1.746 |
| 2019-04-08 07:18:00 | 1.745 |
| 2019-04-08 07:19:00 | 1.746 |
| 2019-04-08 07:20:00 | 1.746 |
| 2019-04-08 07:21:00 | 1.746 |
| 2019-04-08 07:22:00 | 1.746 |
| 2019-04-08 07:23:00 | 1.746 |
| 2019-04-08 07:24:00 | 1.746 |
| 2019-04-08 07:25:00 | 1.747 |
| 2019-04-08 07:26:00 | 1.747 |
| 2019-04-08 07:27:00 | 1.747 |
| 2019-04-08 07:28:00 | 1.747 |
| 2019-04-08 07:29:00 | 1.747 |
| 2019-04-08 07:30:00 | 1.747 |
| 2019-04-08 07:31:00 | 1.747 |
| 2019-04-08 07:32:00 | 1.747 |
| 2019-04-08 07:33:00 | 1.746 |
| 2019-04-08 07:34:00 | 1.746 |
| 2019-04-08 07:35:00 | 1.746 |
| 2019-04-08 07:36:00 | 1.746 |
| 2019-04-08 07:37:00 | 1.746 |
| 2019-04-08 07:38:00 | 1.746 |
| 2019-04-08 07:39:00 | 1.746 |
| 2019-04-08 07:40:00 | 1.746 |
| 2019-04-08 07:41:00 | 1.746 |
| 2019-04-08 07:42:00 | 1.746 |
| 2019-04-08 07:43:00 | 1.747 |
| 2019-04-08 07:44:00 | 1.747 |
| 2019-04-08 07:45:00 | 1.747 |
| 2019-04-08 07:46:00 | 1.747 |
| 2019-04-08 07:47:00 | 1.747 |
| 2019-04-08 07:48:00 | 1.747 |
| 2019-04-08 07:49:00 | 1.747 |
| 2019-04-08 07:50:00 | 1.747 |
| 2019-04-08 07:51:00 | 1.747 |
| 2019-04-08 07:52:00 | 1.746 |
| 2019-04-08 07:53:00 | 1.746 |
| 2019-04-08 07:54:00 | 1.747 |
| 2019-04-08 07:55:00 | 1.746 |
| 2019-04-08 07:56:00 | 1.747 |
| 2019-04-08 07:57:00 | 1.746 |
| 2019-04-08 07:58:00 | 1.747 |
| 2019-04-08 07:59:00 | 1.746 |
| 2019-04-08 08:00:00 | 1.747 |
| 2019-04-08 08:01:00 | 1.747 |
| 2019-04-08 08:02:00 | 1.747 |
| 2019-04-08 08:03:00 | 1.747 |
| 2019-04-08 08:04:00 | 1.747 |
| 2019-04-08 08:05:00 | 1.747 |
| 2019-04-08 08:06:00 | 1.747 |
| 2019-04-08 08:07:00 | 1.747 |
| 2019-04-08 08:08:00 | 1.747 |
| 2019-04-08 08:09:00 | 1.747 |
| 2019-04-08 08:10:00 | 1.747 |
| 2019-04-08 08:11:00 | 1.747 |
| 2019-04-08 08:12:00 | 1.747 |
| 2019-04-08 08:13:00 | 1.747 |
| 2019-04-08 08:14:00 | 1.747 |
| 2019-04-08 08:15:00 | 1.747 |
| 2019-04-08 08:16:00 | 1.747 |
| 2019-04-08 08:17:00 | 1.747 |
| 2019-04-08 08:18:00 | 1.747 |
| 2019-04-08 08:19:00 | 1.747 |
| 2019-04-08 08:20:00 | 1.747 |
| 2019-04-08 08:21:00 | 1.747 |
| 2019-04-08 08:22:00 | 1.747 |
| 2019-04-08 08:23:00 | 1.748 |
| 2019-04-08 08:24:00 | 1.748 |
| 2019-04-08 08:25:00 | 1.748 |
| 2019-04-08 08:26:00 | 1.747 |
| 2019-04-08 08:27:00 | 1.747 |
| 2019-04-08 08:28:00 | 1.747 |
| 2019-04-08 08:29:00 | 1.748 |
| 2019-04-08 08:30:00 | 1.747 |
| 2019-04-08 08:31:00 | 1.747 |
| 2019-04-08 08:32:00 | 1.747 |
| 2019-04-08 08:33:00 | 1.747 |
| 2019-04-08 08:34:00 | 1.747 |
| 2019-04-08 08:35:00 | 1.747 |
| 2019-04-08 08:36:00 | 1.747 |
| 2019-04-08 08:37:00 | 1.746 |
| 2019-04-08 08:38:00 | 1.746 |
| 2019-04-08 08:39:00 | 1.746 |
| 2019-04-08 08:40:00 | 1.746 |
| 2019-04-08 08:41:00 | 1.746 |
| 2019-04-08 08:42:00 | 1.746 |
| 2019-04-08 08:43:00 | 1.746 |
| 2019-04-08 08:44:00 | 1.747 |
| 2019-04-08 08:45:00 | 1.747 |
| 2019-04-08 08:46:00 | 1.747 |
| 2019-04-08 08:47:00 | 1.747 |
| 2019-04-08 08:48:00 | 1.747 |
| 2019-04-08 08:49:00 | 1.747 |
| 2019-04-08 08:50:00 | 1.746 |
| 2019-04-08 08:51:00 | 1.746 |
| 2019-04-08 08:52:00 | 1.747 |
| 2019-04-08 08:53:00 | 1.747 |
| 2019-04-08 08:54:00 | 1.747 |
| 2019-04-08 08:55:00 | 1.747 |
| 2019-04-08 08:56:00 | 1.747 |
| 2019-04-08 08:57:00 | 1.747 |
| 2019-04-08 08:58:00 | 1.747 |
| 2019-04-08 08:59:00 | 1.747 |
| 2019-04-08 09:00:00 | 1.747 |
| 2019-04-08 09:01:00 | 1.747 |
| 2019-04-08 09:02:00 | 1.747 |
| 2019-04-08 09:03:00 | 1.747 |
| 2019-04-08 09:04:00 | 1.747 |
| 2019-04-08 09:05:00 | 1.747 |
| 2019-04-08 09:06:00 | 1.747 |
| 2019-04-08 09:07:00 | 1.747 |
| 2019-04-08 09:08:00 | 1.747 |
| 2019-04-08 09:09:00 | 1.747 |
| 2019-04-08 09:10:00 | 1.746 |
| 2019-04-08 09:11:00 | 1.747 |
| 2019-04-08 09:12:00 | 1.746 |
| 2019-04-08 09:13:00 | 1.746 |
| 2019-04-08 09:14:00 | 1.746 |
| 2019-04-08 09:15:00 | 1.746 |
| 2019-04-08 09:16:00 | 1.746 |
| 2019-04-08 09:17:00 | 1.746 |
| 2019-04-08 09:18:00 | 1.745 |
| 2019-04-08 09:19:00 | 1.745 |
| 2019-04-08 09:20:00 | 1.745 |
| 2019-04-08 09:21:00 | 1.746 |
| 2019-04-08 09:22:00 | 1.745 |
| 2019-04-08 09:23:00 | 1.745 |
| 2019-04-08 09:24:00 | 1.745 |
| 2019-04-08 09:25:00 | 1.745 |
| 2019-04-08 09:26:00 | 1.745 |
| 2019-04-08 09:27:00 | 1.745 |
| 2019-04-08 09:28:00 | 1.746 |
| 2019-04-08 09:29:00 | 1.746 |
| 2019-04-08 09:30:00 | 1.746 |
| 2019-04-08 09:31:00 | 1.746 |
| 2019-04-08 09:32:00 | 1.746 |
| 2019-04-08 09:33:00 | 1.746 |
| 2019-04-08 09:34:00 | 1.746 |
| 2019-04-08 09:35:00 | 1.746 |
| 2019-04-08 09:36:00 | 1.746 |
| 2019-04-08 09:37:00 | 1.746 |
| 2019-04-08 09:38:00 | 1.747 |
| 2019-04-08 09:39:00 | 1.747 |
| 2019-04-08 09:40:00 | 1.746 |
| 2019-04-08 09:41:00 | 1.746 |
| 2019-04-08 09:42:00 | 1.746 |
| 2019-04-08 09:43:00 | 1.746 |
| 2019-04-08 09:44:00 | 1.746 |
| 2019-04-08 09:45:00 | 1.746 |
| 2019-04-08 09:46:00 | 1.747 |
| 2019-04-08 09:47:00 | 1.746 |
| 2019-04-08 09:48:00 | 1.746 |
| 2019-04-08 09:49:00 | 1.746 |
| 2019-04-08 09:50:00 | 1.746 |
| 2019-04-08 09:51:00 | 1.747 |
| 2019-04-08 09:52:00 | 1.747 |
| 2019-04-08 09:53:00 | 1.747 |
| 2019-04-08 09:54:00 | 1.747 |
| 2019-04-08 09:55:00 | 1.747 |
| 2019-04-08 09:56:00 | 1.747 |
| 2019-04-08 09:57:00 | 1.747 |
| 2019-04-08 09:58:00 | 1.747 |
| 2019-04-08 09:59:00 | 1.747 |
| 2019-04-08 10:00:00 | 1.747 |
| 2019-04-08 10:01:00 | 1.747 |
| 2019-04-08 10:02:00 | 1.747 |
| 2019-04-08 10:03:00 | 1.747 |
| 2019-04-08 10:04:00 | 1.747 |
| 2019-04-08 10:05:00 | 1.747 |